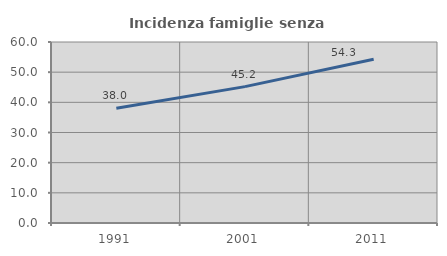
| Category | Incidenza famiglie senza nuclei |
|---|---|
| 1991.0 | 38.021 |
| 2001.0 | 45.205 |
| 2011.0 | 54.31 |